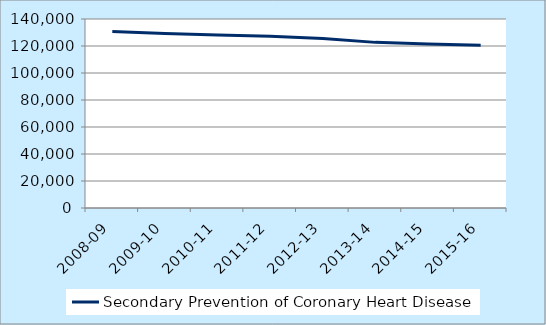
| Category | Secondary Prevention of Coronary Heart Disease  |
|---|---|
| 2008-09 | 130725 |
| 2009-10 | 129223 |
| 2010-11 | 128114 |
| 2011-12 | 127200 |
| 2012-13 | 125567 |
| 2013-14 | 122688 |
| 2014-15 | 121442 |
| 2015-16 | 120620 |